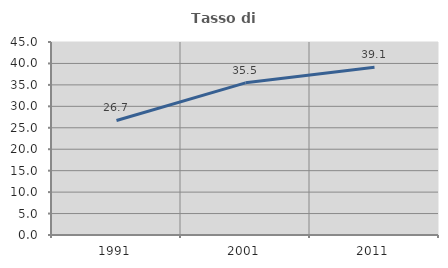
| Category | Tasso di occupazione   |
|---|---|
| 1991.0 | 26.704 |
| 2001.0 | 35.479 |
| 2011.0 | 39.102 |